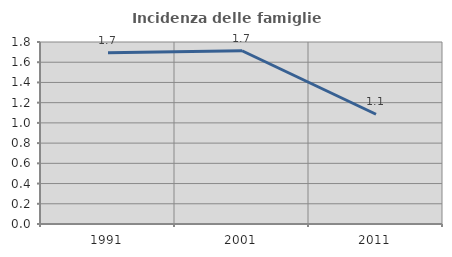
| Category | Incidenza delle famiglie numerose |
|---|---|
| 1991.0 | 1.695 |
| 2001.0 | 1.713 |
| 2011.0 | 1.085 |